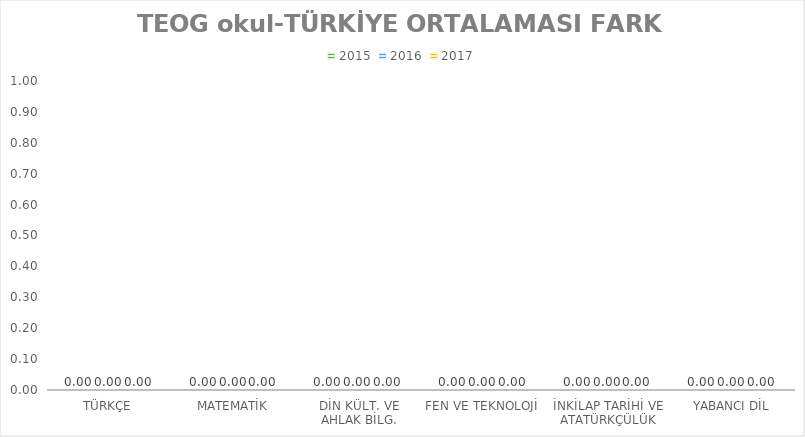
| Category | 2015 | 2016 | 2017 |
|---|---|---|---|
| TÜRKÇE | 0 | 0 | 0 |
| MATEMATİK | 0 | 0 | 0 |
| DİN KÜLT. VE AHLAK BİLG. | 0 | 0 | 0 |
| FEN VE TEKNOLOJİ | 0 | 0 | 0 |
| İNKİLAP TARİHİ VE ATATÜRKÇÜLÜK | 0 | 0 | 0 |
| YABANCI DİL | 0 | 0 | 0 |